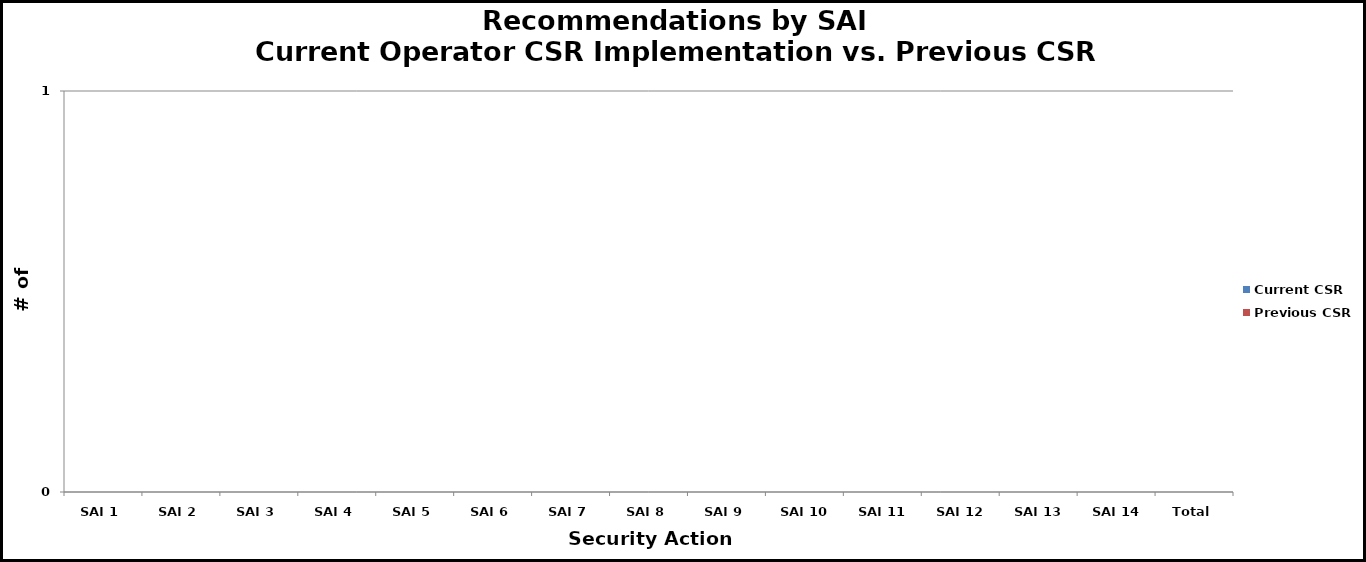
| Category | Current CSR | Previous CSR |
|---|---|---|
| SAI 1 | 0 | 0 |
| SAI 2 | 0 | 0 |
| SAI 3 | 0 | 0 |
| SAI 4 | 0 | 0 |
| SAI 5 | 0 | 0 |
| SAI 6 | 0 | 0 |
| SAI 7 | 0 | 0 |
| SAI 8 | 0 | 0 |
| SAI 9 | 0 | 0 |
| SAI 10 | 0 | 0 |
| SAI 11 | 0 | 0 |
| SAI 12 | 0 | 0 |
| SAI 13 | 0 | 0 |
| SAI 14 | 0 | 0 |
| Total | 0 | 0 |